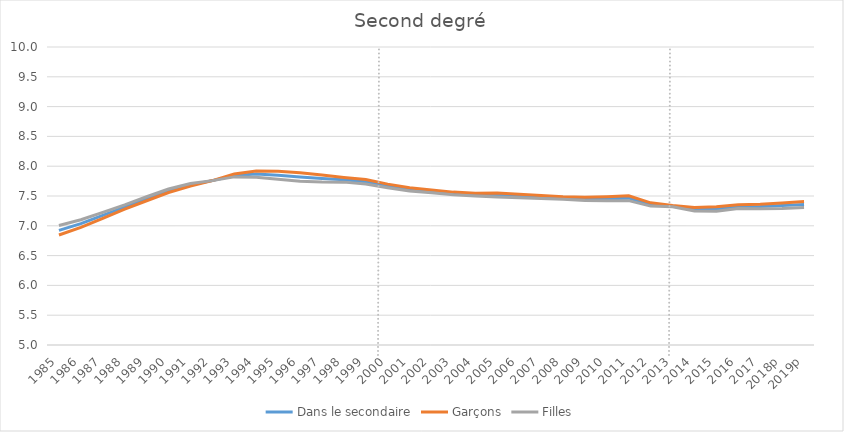
| Category | Dans le secondaire | Garçons | Filles |
|---|---|---|---|
| 1985 | 6.923 | 6.846 | 7.005 |
| 1986 | 7.036 | 6.973 | 7.102 |
| 1987 | 7.175 | 7.126 | 7.226 |
| 1988 | 7.314 | 7.278 | 7.352 |
| 1989 | 7.453 | 7.42 | 7.488 |
| 1990 | 7.587 | 7.559 | 7.617 |
| 1991 | 7.687 | 7.665 | 7.71 |
| 1992 | 7.758 | 7.759 | 7.758 |
| 1993 | 7.845 | 7.868 | 7.821 |
| 1994 | 7.868 | 7.92 | 7.815 |
| 1995 | 7.849 | 7.914 | 7.783 |
| 1996 | 7.821 | 7.89 | 7.749 |
| 1997 | 7.794 | 7.853 | 7.733 |
| 1998 | 7.773 | 7.812 | 7.733 |
| 1999 | 7.741 | 7.778 | 7.702 |
| 2000 | 7.669 | 7.699 | 7.64 |
| 2001 | 7.611 | 7.638 | 7.584 |
| 2002 | 7.577 | 7.6 | 7.554 |
| 2003 | 7.542 | 7.565 | 7.519 |
| 2004 | 7.523 | 7.546 | 7.501 |
| 2005 | 7.518 | 7.552 | 7.483 |
| 2006 | 7.499 | 7.527 | 7.469 |
| 2007 | 7.483 | 7.509 | 7.457 |
| 2008 | 7.467 | 7.487 | 7.445 |
| 2009 | 7.452 | 7.478 | 7.426 |
| 2010 | 7.454 | 7.487 | 7.419 |
| 2011 | 7.464 | 7.503 | 7.422 |
| 2012 | 7.359 | 7.385 | 7.33 |
| 2013 | 7.33 | 7.342 | 7.318 |
| 2014 | 7.279 | 7.308 | 7.249 |
| 2015 | 7.283 | 7.319 | 7.245 |
| 2016 | 7.321 | 7.352 | 7.288 |
| 2017 | 7.325 | 7.36 | 7.287 |
| 2018p | 7.339 | 7.384 | 7.29 |
| 2019p | 7.359 | 7.408 | 7.306 |